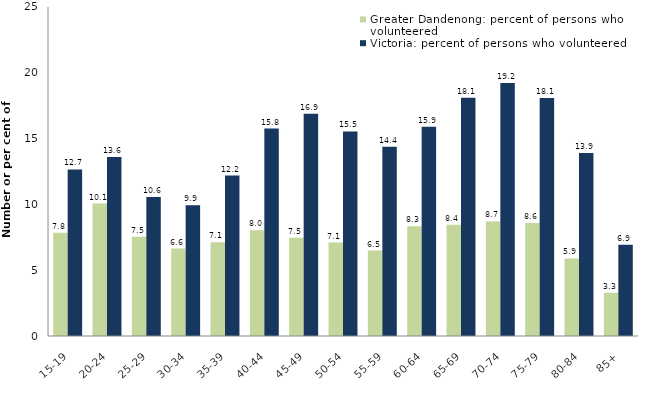
| Category | Greater Dandenong: percent of persons who volunteered | Victoria: percent of persons who volunteered |
|---|---|---|
| 15-19 | 7.84 | 12.66 |
| 20-24 | 10.068 | 13.608 |
| 25-29 | 7.542 | 10.554 |
| 30-34 | 6.645 | 9.932 |
| 35-39 | 7.119 | 12.188 |
| 40-44 | 8.035 | 15.765 |
| 45-49 | 7.458 | 16.88 |
| 50-54 | 7.104 | 15.547 |
| 55-59 | 6.491 | 14.381 |
| 60-64 | 8.339 | 15.9 |
| 65-69 | 8.445 | 18.11 |
| 70-74 | 8.703 | 19.22 |
| 75-79 | 8.587 | 18.09 |
| 80-84 | 5.892 | 13.903 |
| 85+ | 3.285 | 6.939 |